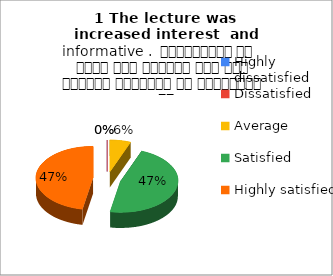
| Category | 1 The lecture was  increased interest  and informative .  व्याख्यान से रुचि में वृद्धि हुई एवं शिक्षण जानकारी से परिपूर्ण था |
|---|---|
| Highly dissatisfied | 0 |
| Dissatisfied | 0 |
| Average | 1 |
| Satisfied | 8 |
| Highly satisfied | 8 |